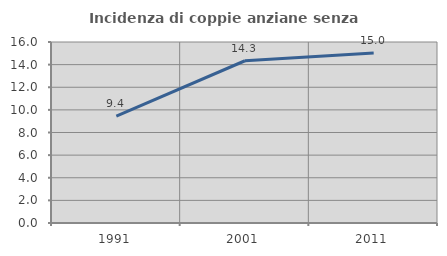
| Category | Incidenza di coppie anziane senza figli  |
|---|---|
| 1991.0 | 9.442 |
| 2001.0 | 14.343 |
| 2011.0 | 15.038 |